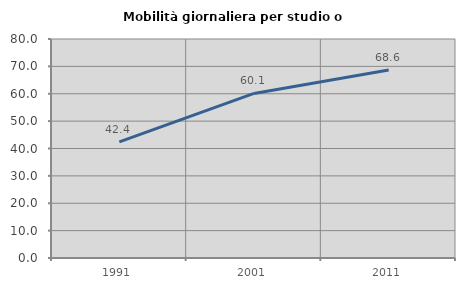
| Category | Mobilità giornaliera per studio o lavoro |
|---|---|
| 1991.0 | 42.4 |
| 2001.0 | 60.123 |
| 2011.0 | 68.639 |